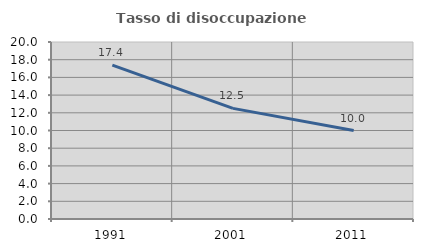
| Category | Tasso di disoccupazione giovanile  |
|---|---|
| 1991.0 | 17.391 |
| 2001.0 | 12.5 |
| 2011.0 | 10 |